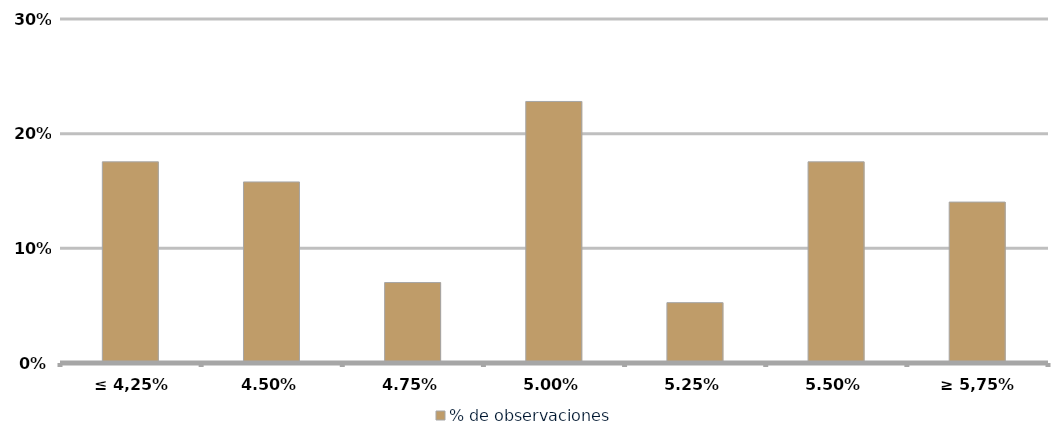
| Category | % de observaciones  |
|---|---|
| ≤ 4,25% | 0.175 |
| 4,50% | 0.158 |
| 4,75% | 0.07 |
| 5,00% | 0.228 |
| 5,25% | 0.053 |
| 5,50% | 0.175 |
| ≥ 5,75% | 0.14 |